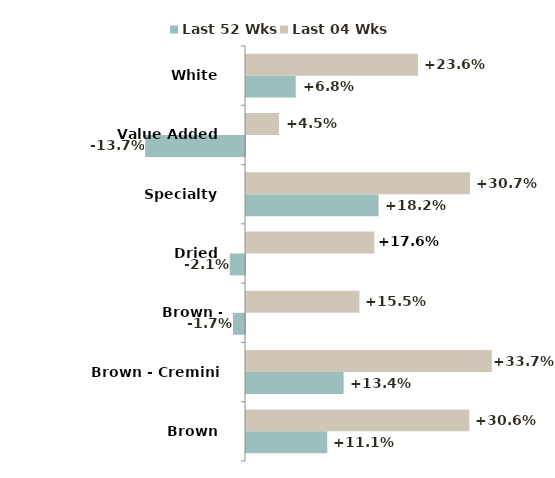
| Category | Last 52 Wks | Last 04 Wks |
|---|---|---|
| Brown | 0.111 | 0.306 |
| Brown - Cremini | 0.134 | 0.337 |
| Brown - Portabella | -0.017 | 0.155 |
| Dried | -0.021 | 0.176 |
| Specialty | 0.182 | 0.307 |
| Value Added | -0.137 | 0.045 |
| White | 0.068 | 0.236 |